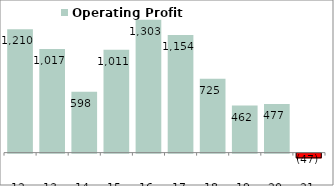
| Category | Operating Profit |
|---|---|
| 2012-03-31 | 1209.88 |
| 2013-03-31 | 1017.33 |
| 2014-03-31 | 598.16 |
| 2015-03-31 | 1010.76 |
| 2016-03-31 | 1303.12 |
| 2017-03-31 | 1153.92 |
| 2018-03-31 | 725.06 |
| 2019-03-31 | 461.6 |
| 2020-03-31 | 476.87 |
| 2021-03-31 | -46.55 |